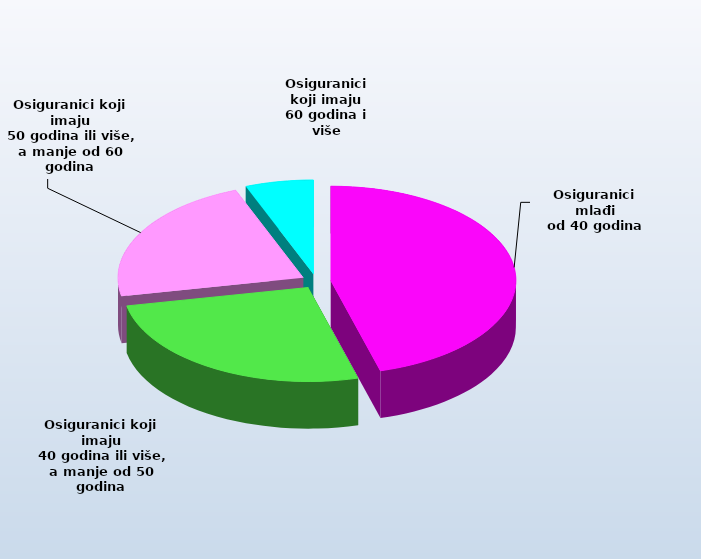
| Category | Series 0 |
|---|---|
| Osiguranici mlađi
od 40 godina | 727779 |
| Osiguranici koji imaju
 40 godina ili više, a manje od 50 godina | 417323 |
| Osiguranici koji imaju
 50 godina ili više, a manje od 60 godina | 353782 |
| Osiguranici koji imaju
60 godina i više | 94699 |